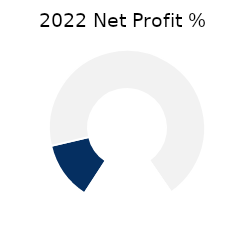
| Category | Top |
|---|---|
| 0 | 19.45 |
| 1 | 110.55 |
| 2 | 30 |